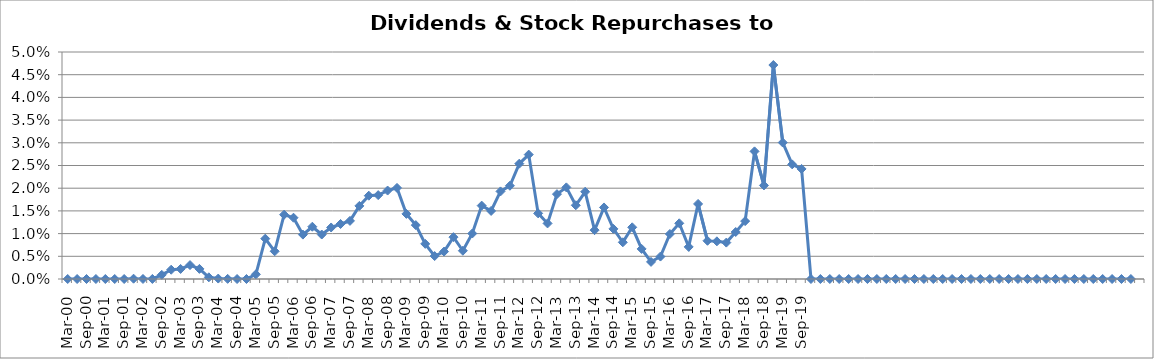
| Category | Dividends & Stock Repurchases to Revenue% |
|---|---|
| Mar-00 | 0 |
| Jun-00 | 0 |
| Sep-00 | 0 |
| Dec-00 | 0 |
| Mar-01 | 0 |
| Jun-01 | 0 |
| Sep-01 | 0 |
| Dec-01 | 0 |
| Mar-02 | 0 |
| Jun-02 | 0 |
| Sep-02 | 0.001 |
| Dec-02 | 0.002 |
| Mar-03 | 0.002 |
| Jun-03 | 0.003 |
| Sep-03 | 0.002 |
| Dec-03 | 0 |
| Mar-04 | 0 |
| Jun-04 | 0 |
| Sep-04 | 0 |
| Dec-04 | 0 |
| Mar-05 | 0.001 |
| Jun-05 | 0.009 |
| Sep-05 | 0.006 |
| Dec-05 | 0.014 |
| Mar-06 | 0.013 |
| Jun-06 | 0.01 |
| Sep-06 | 0.012 |
| Dec-06 | 0.01 |
| Mar-07 | 0.011 |
| Jun-07 | 0.012 |
| Sep-07 | 0.013 |
| Dec-07 | 0.016 |
| Mar-08 | 0.018 |
| Jun-08 | 0.018 |
| Sep-08 | 0.019 |
| Dec-08 | 0.02 |
| Mar-09 | 0.014 |
| Jun-09 | 0.012 |
| Sep-09 | 0.008 |
| Dec-09 | 0.005 |
| Mar-10 | 0.006 |
| Jun-10 | 0.009 |
| Sep-10 | 0.006 |
| Dec-10 | 0.01 |
| Mar-11 | 0.016 |
| Jun-11 | 0.015 |
| Sep-11 | 0.019 |
| Dec-11 | 0.021 |
| Mar-12 | 0.025 |
| Jun-12 | 0.027 |
| Sep-12 | 0.014 |
| Dec-12 | 0.012 |
| Mar-13 | 0.019 |
| Jun-13 | 0.02 |
| Sep-13 | 0.016 |
| Dec-13 | 0.019 |
| Mar-14 | 0.011 |
| Jun-14 | 0.016 |
| Sep-14 | 0.011 |
| Dec-14 | 0.008 |
| Mar-15 | 0.011 |
| Jun-15 | 0.007 |
| Sep-15 | 0.004 |
| Dec-15 | 0.005 |
| Mar-16 | 0.01 |
| Jun-16 | 0.012 |
| Sep-16 | 0.007 |
| Dec-16 | 0.017 |
| Mar-17 | 0.008 |
| Jun-17 | 0.008 |
| Sep-17 | 0.008 |
| Dec-17 | 0.01 |
| Mar-18 | 0.013 |
| Jun-18 | 0.028 |
| Sep-18 | 0.021 |
| Dec-18 | 0.047 |
| Mar-19 | 0.03 |
| Jun-19 | 0.025 |
| Sep-19 | 0.024 |